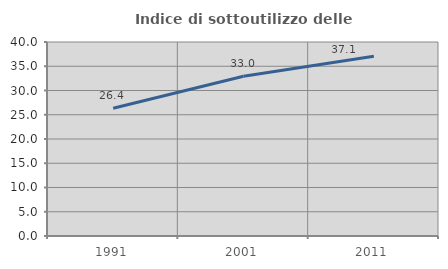
| Category | Indice di sottoutilizzo delle abitazioni  |
|---|---|
| 1991.0 | 26.357 |
| 2001.0 | 32.95 |
| 2011.0 | 37.066 |